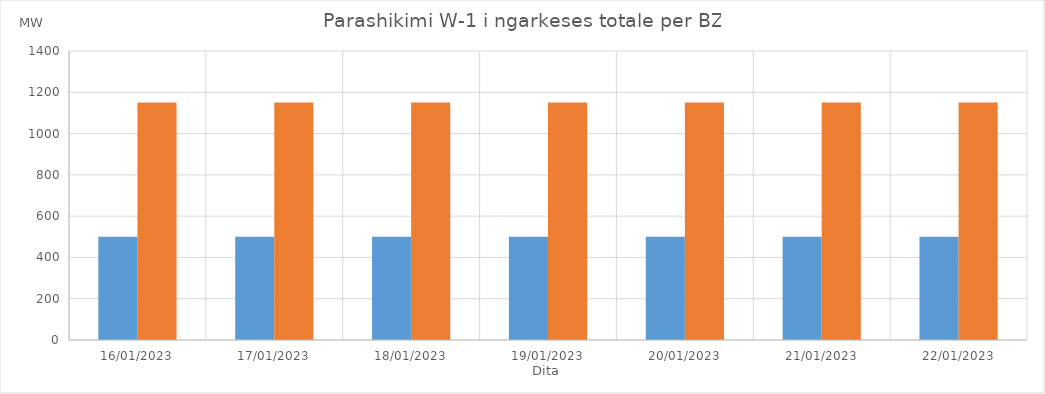
| Category | Min (MW) | Max (MW) |
|---|---|---|
| 16/01/2023 | 500 | 1150 |
| 17/01/2023 | 500 | 1150 |
| 18/01/2023 | 500 | 1150 |
| 19/01/2023 | 500 | 1150 |
| 20/01/2023 | 500 | 1150 |
| 21/01/2023 | 500 | 1150 |
| 22/01/2023 | 500 | 1150 |